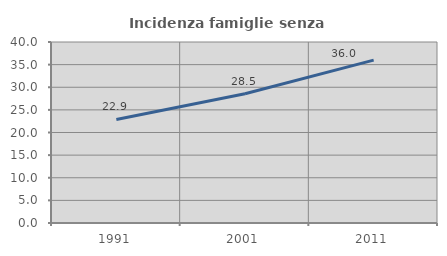
| Category | Incidenza famiglie senza nuclei |
|---|---|
| 1991.0 | 22.874 |
| 2001.0 | 28.549 |
| 2011.0 | 35.993 |